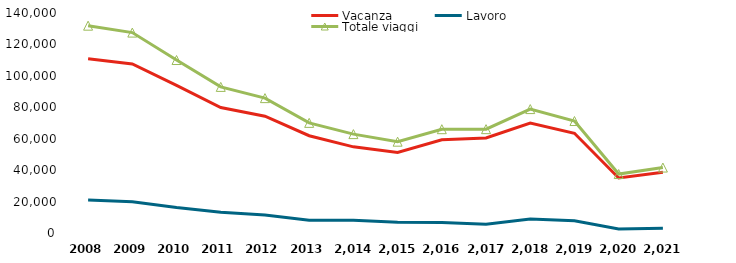
| Category | Vacanza | Lavoro | Totale viaggi |
|---|---|---|---|
| 2008 | 110901 | 21026 | 131928 |
| 2009 | 107603 | 19931 | 127533 |
| 2010 | 93894 | 16179 | 110073 |
| 2011 | 79811 | 13160 | 92971 |
| 2012 | 74301 | 11524 | 85825 |
| 2013 | 61916 | 8167 | 70083 |
| 2014 | 54816 | 8112 | 62927 |
| 2015 | 51222 | 6894 | 58115 |
| 2016 | 59298 | 6757 | 66055 |
| 2017 | 60455 | 5626 | 66081 |
| 2018 | 70004 | 8848 | 78853 |
| 2019 | 63467 | 7788 | 71254 |
| 2020 | 35024 | 2503 | 37527 |
| 2021 | 38685 | 2963 | 41648 |